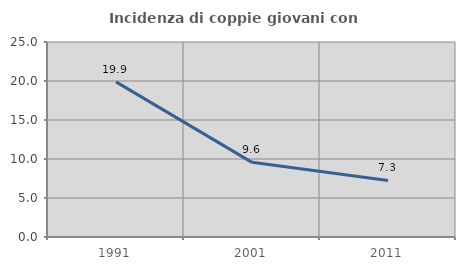
| Category | Incidenza di coppie giovani con figli |
|---|---|
| 1991.0 | 19.886 |
| 2001.0 | 9.572 |
| 2011.0 | 7.256 |